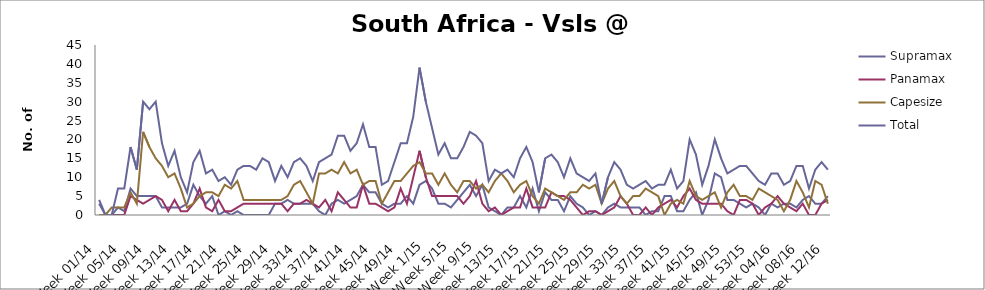
| Category | Supramax | Panamax | Capesize | Total |
|---|---|---|---|---|
| Week 01/14 | 3 | 0 | 0 | 4 |
| Week 02/14 | 0 | 0 | 0 | 0 |
| Week 03/14 | 0 | 0 | 2 | 0 |
| Week 04/14 | 2 | 0 | 2 | 7 |
| Week 05/14 | 1 | 0 | 2 | 7 |
| Week 06/14 | 7 | 5 | 6 | 18 |
| Week 07/14 | 5 | 4 | 3 | 12 |
| Week 08/14 | 5 | 3 | 22 | 30 |
| Week 09/14 | 5 | 4 | 18 | 28 |
| Week 10/14 | 5 | 5 | 15 | 30 |
| Week 11/14 | 2 | 4 | 13 | 19 |
| Week 12/14 | 2 | 1 | 10 | 13 |
| Week 13/14 | 2 | 4 | 11 | 17 |
| Week 14/14 | 2 | 1 | 7 | 10 |
| Week 15/14 | 3 | 1 | 2 | 6 |
| Week 16/14 | 8 | 3 | 3 | 14 |
| Week 17/14 | 5 | 7 | 5 | 17 |
| Week 18/14 | 3 | 2 | 6 | 11 |
| Week 19/14 | 5 | 1 | 6 | 12 |
| Week 20/14 | 0 | 4 | 5 | 9 |
| Week 21/14 | 1 | 1 | 8 | 10 |
| Week 22/14 | 0 | 1 | 7 | 8 |
| Week 23/14 | 1 | 2 | 9 | 12 |
| Week 24/14 | 0 | 3 | 4 | 13 |
| Week 25/14 | 0 | 3 | 4 | 13 |
| Week 26/14 | 0 | 3 | 4 | 12 |
| Week 27/14 | 0 | 3 | 4 | 15 |
| Week 28/14 | 0 | 3 | 4 | 14 |
| Week 29/14 | 3 | 3 | 4 | 9 |
| Week 30/14 | 3 | 3 | 4 | 13 |
| Week 31/14 | 4 | 1 | 5 | 10 |
| Week 32/14 | 3 | 3 | 8 | 14 |
| Week 33/14 | 3 | 3 | 9 | 15 |
| Week 34/14 | 3 | 4 | 6 | 13 |
| Week 35/14 | 3 | 3 | 3 | 9 |
| Week 36/14 | 1 | 2 | 11 | 14 |
| Week 37/14 | 0 | 4 | 11 | 15 |
| Week 38/14 | 3 | 1 | 12 | 16 |
| Week 39/14 | 4 | 6 | 11 | 21 |
| Week 40/14 | 3 | 4 | 14 | 21 |
| Week 41/14 | 4 | 2 | 11 | 17 |
| Week 42/14 | 5 | 2 | 12 | 19 |
| Week 43/14 | 8 | 8 | 8 | 24 |
| Week 44/14 | 6 | 3 | 9 | 18 |
| Week 45/14 | 6 | 3 | 9 | 18 |
| Week 46/14 | 3 | 2 | 3 | 8 |
| Week 47/14 | 2 | 1 | 6 | 9 |
| Week 48/14 | 3 | 2 | 9 | 14 |
| Week 49/14 | 3 | 7 | 9 | 19 |
| Week 50/14 | 5 | 3 | 11 | 19 |
| Week 51/14 | 3 | 10 | 13 | 26 |
| Week 52/14 | 8 | 17 | 14 | 39 |
| Week 1/15 | 9 | 10 | 11 | 30 |
| Week 2/15 | 7 | 5 | 11 | 23 |
| Week 3/15 | 3 | 5 | 8 | 16 |
| Week 4/15 | 3 | 5 | 11 | 19 |
| Week 5/15 | 2 | 5 | 8 | 15 |
| Week 6/15 | 4 | 5 | 6 | 15 |
| Week 7/15 | 6 | 3 | 9 | 18 |
| Week 8/15 | 8 | 5 | 9 | 22 |
| Week 9/15 | 5 | 9 | 7 | 21 |
| Week 10/15 | 8 | 3 | 8 | 19 |
| Week 11/15 | 2 | 1 | 6 | 9 |
| Week 12/15 | 1 | 2 | 9 | 12 |
| Week 13/15 | 0 | 0 | 11 | 11 |
| Week 14/15 | 2 | 1 | 9 | 12 |
| Week 15/15 | 2 | 2 | 6 | 10 |
| Week 16/15 | 5 | 2 | 8 | 15 |
| Week 17/15 | 2 | 7 | 9 | 18 |
| Week 18/15 | 7 | 2 | 5 | 14 |
| Week 19/15 | 1 | 2 | 3 | 6 |
| Week 20/15 | 6 | 2 | 7 | 15 |
| Week 21/15 | 4 | 6 | 6 | 16 |
| Week 22/15 | 4 | 5 | 5 | 14 |
| Week 23/15 | 1 | 5 | 4 | 10 |
| Week 24/15 | 5 | 4 | 6 | 15 |
| Week 25/15 | 3 | 2 | 6 | 11 |
| Week 26/15 | 2 | 0 | 8 | 10 |
| Week 27/15 | 0 | 1 | 7 | 9 |
| Week 28/15 | 1 | 1 | 8 | 11 |
| Week 29/15 | 0 | 0 | 3 | 3 |
| Week 30/15 | 2 | 1 | 7 | 10 |
| Week 31/15 | 3 | 2 | 9 | 14 |
| Week 32/15 | 2 | 5 | 5 | 12 |
| Week 33/15 | 2 | 3 | 3 | 8 |
| Week 34/15 | 2 | 0 | 5 | 7 |
| Week 35/15 | 2 | 0 | 5 | 8 |
| Week 36/15 | 0 | 2 | 7 | 9 |
| Week 37/15 | 1 | 0 | 6 | 7 |
| Week 38/15 | 1 | 2 | 5 | 8 |
| Week 39/15 | 5 | 3 | 0 | 8 |
| Week 40/15 | 5 | 4 | 3 | 12 |
| Week 41/15 | 1 | 2 | 4 | 7 |
| Week 42/15 | 1 | 5 | 3 | 9 |
| Week 43/15 | 4 | 7 | 9 | 20 |
| Week 44/15 | 6 | 4 | 5 | 16 |
| Week 45/15 | 0 | 3 | 4 | 8 |
| Week 46/15 | 4 | 3 | 5 | 13 |
| Week 47/15 | 11 | 3 | 6 | 20 |
| Week 48/15 | 10 | 3 | 2 | 15 |
| Week 49/15 | 4 | 1 | 6 | 11 |
| Week 50/15 | 4 | 0 | 8 | 12 |
| Week 51/15 | 3 | 4 | 5 | 13 |
| Week 52/15 | 2 | 4 | 5 | 13 |
| Week 53/15 | 3 | 3 | 4 | 11 |
| Week 01/16 | 2 | 0 | 7 | 9 |
| Week 02/16 | 0 | 2 | 6 | 8 |
| Week 03/16 | 3 | 3 | 5 | 11 |
| Week 04/16 | 2 | 5 | 4 | 11 |
| Week 05/16 | 3 | 3 | 1 | 8 |
| Week 06/16 | 3 | 2 | 4 | 9 |
| Week 07/16 | 2 | 1 | 9 | 13 |
| Week 08/16 | 4 | 3 | 6 | 13 |
| Week 09/16 | 5 | 0 | 2 | 7 |
| Week 10/16 | 3 | 0 | 9 | 12 |
| Week 11/16 | 3 | 3 | 8 | 14 |
| Week 12/16 | 5 | 4 | 3 | 12 |